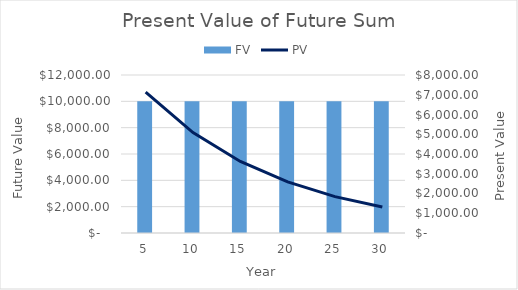
| Category | FV |
|---|---|
| 5.0 | 10000 |
| 10.0 | 10000 |
| 15.0 | 10000 |
| 20.0 | 10000 |
| 25.0 | 10000 |
| 30.0 | 10000 |